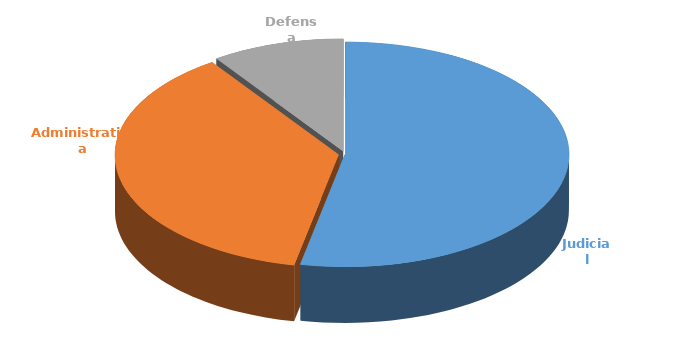
| Category | Cantidad |
|---|---|
| Judicial | 333 |
| Administrativa | 233 |
| Defensa | 60 |